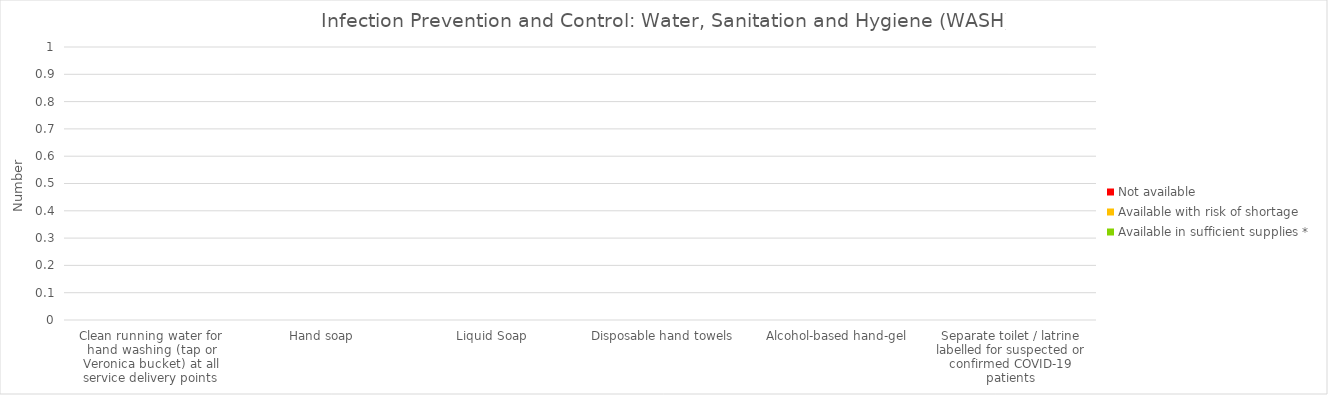
| Category | Available in sufficient supplies * | Available with risk of shortage | Not available |
|---|---|---|---|
| Clean running water for hand washing (tap or Veronica bucket) at all service delivery points | 0 | 0 | 0 |
| Hand soap | 0 | 0 | 0 |
| Liquid Soap  | 0 | 0 | 0 |
| Disposable hand towels  | 0 | 0 | 0 |
| Alcohol-based hand-gel | 0 | 0 | 0 |
| Separate toilet / latrine labelled for suspected or confirmed COVID-19 patients | 0 | 0 | 0 |